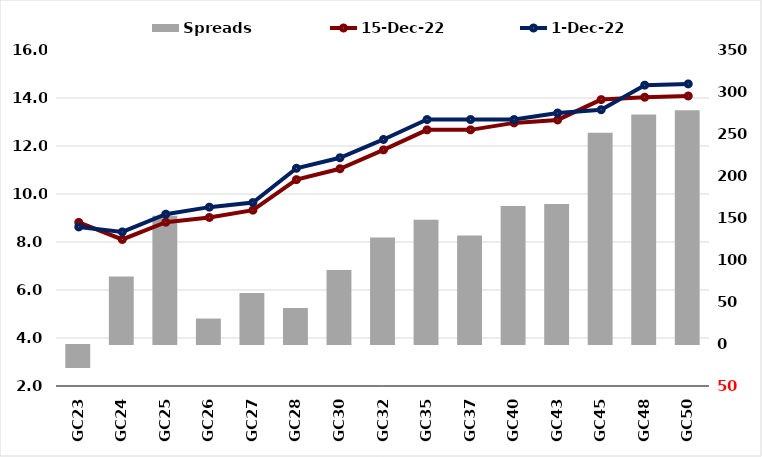
| Category |  Spreads   |
|---|---|
|  | -27.388 |
| GC23 | 80.495 |
| GC24 | 152.595 |
| GC25 | 30.295 |
| GC26 | 60.779 |
| GC27 | 42.791 |
| GC28 | 88.189 |
| GC30 | 126.887 |
| GC32 | 147.784 |
| GC35 | 129.284 |
| GC37 | 164.285 |
| GC40 | 166.642 |
| GC43 | 251.362 |
| GC45 | 273.347 |
| GC48 | 278.379 |